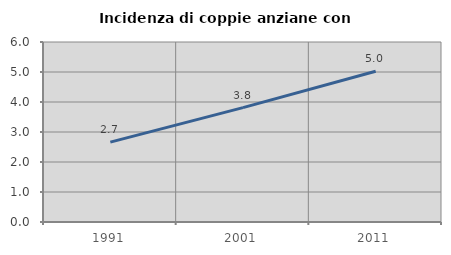
| Category | Incidenza di coppie anziane con figli |
|---|---|
| 1991.0 | 2.664 |
| 2001.0 | 3.814 |
| 2011.0 | 5.023 |